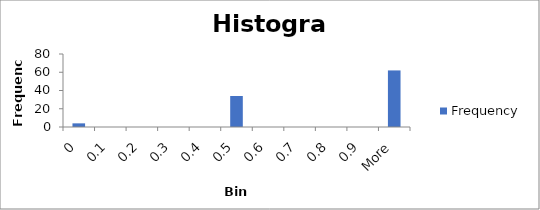
| Category | Frequency |
|---|---|
| 0 | 4 |
| 0.1 | 0 |
| 0.2 | 0 |
| 0.3 | 0 |
| 0.4 | 0 |
| 0.5 | 34 |
| 0.6 | 0 |
| 0.7 | 0 |
| 0.8 | 0 |
| 0.9 | 0 |
| More | 62 |